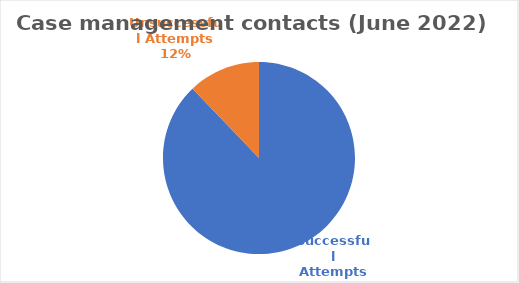
| Category | Series 0 |
|---|---|
| Successful Attempts | 289 |
| Unsuccessful Attempts | 40 |